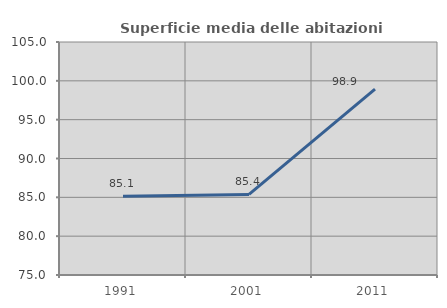
| Category | Superficie media delle abitazioni occupate |
|---|---|
| 1991.0 | 85.138 |
| 2001.0 | 85.374 |
| 2011.0 | 98.925 |